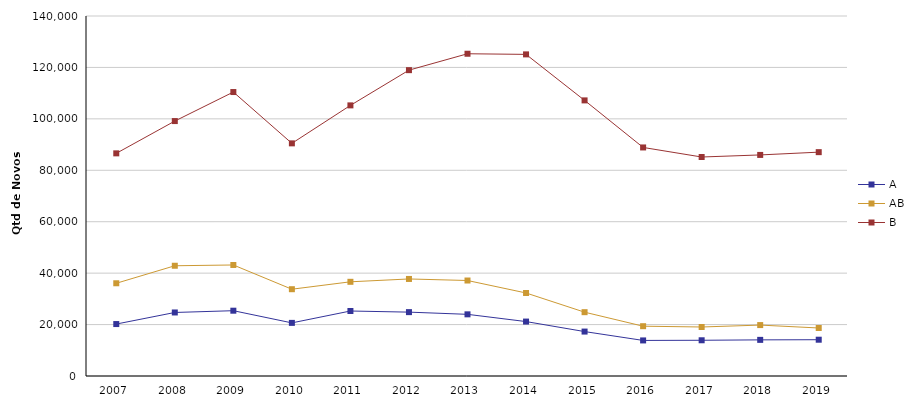
| Category | A | AB | B |
|---|---|---|---|
| 2007 | 20201 | 36063 | 86584 |
| 2008 | 24706 | 42873 | 99142 |
| 2009 | 25395 | 43178 | 110429 |
| 2010 | 20656 | 33753 | 90473 |
| 2011 | 25274 | 36631 | 105242 |
| 2012 | 24840 | 37739 | 118942 |
| 2013 | 23982 | 37135 | 125317 |
| 2014 | 21167 | 32287 | 125074 |
| 2015 | 17278 | 24820 | 107182 |
| 2016 | 13834 | 19369 | 88881 |
| 2017 | 13894 | 19061 | 85161 |
| 2018 | 14051 | 19802 | 85971 |
| 2019 | 14112 | 18671 | 87054 |